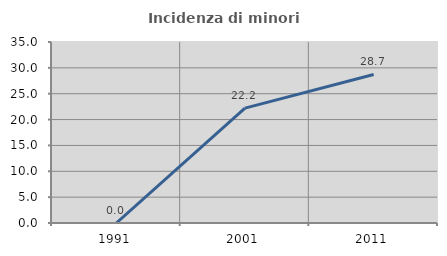
| Category | Incidenza di minori stranieri |
|---|---|
| 1991.0 | 0 |
| 2001.0 | 22.222 |
| 2011.0 | 28.723 |